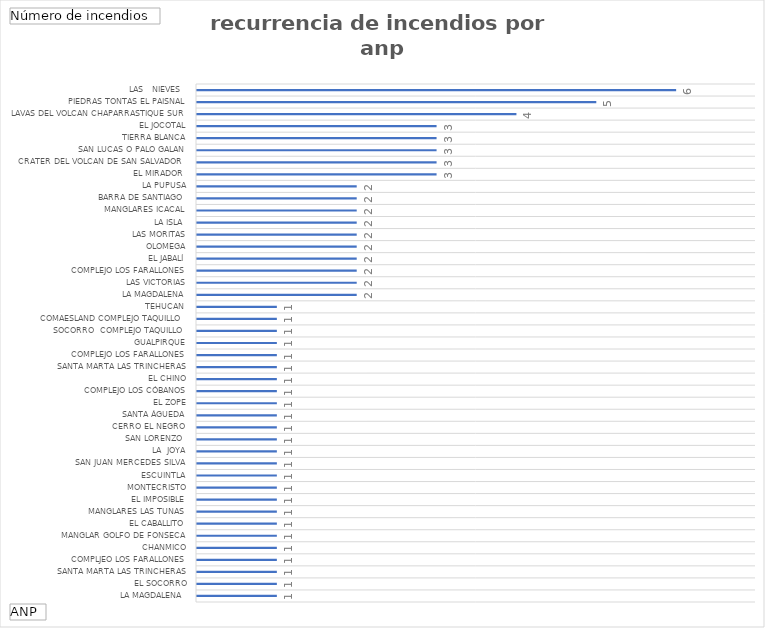
| Category | Total |
|---|---|
| La Magdalena  | 1 |
|  El Socorro | 1 |
|  Santa Marta Las Trincheras, Compljeo Los Farallones | 1 |
| Chanmico | 1 |
| Manglar golfo de Fonseca | 1 |
| El Caballito | 1 |
| Manglares Las Tunas | 1 |
| El Imposible | 1 |
| Montecristo | 1 |
| Escuintla | 1 |
| San Juan Mercedes Silva | 1 |
| La  Joya | 1 |
| San Lorenzo  | 1 |
| Cerro El Negro  | 1 |
| Santa Águeda, El Zope, Complejo Los Cóbanos | 1 |
| El Chino | 1 |
| Santa Marta Las Trincheras, Complejo Los Farallones | 1 |
| Gualpirque | 1 |
| Socorro  Complejo Taquillo  | 1 |
| Comaesland Complejo Taquillo  | 1 |
| Tehucan  | 1 |
| La Magdalena | 1 |
|  Las Victorias, Complejo Los Farallones | 1 |
| El Jabalí | 1 |
|  Olomega | 1 |
| Las Moritas | 2 |
| La Isla  | 2 |
| Manglares Icacal | 2 |
| Barra de Santiago  | 2 |
| La Pupusa | 2 |
| El Mirador  | 2 |
| Crater del Volcan de San Salvador  | 2 |
|  San lucas o Palo galan | 2 |
| Tierra Blanca | 2 |
|  El Jocotal | 2 |
| Lavas del Volcan Chaparrastique sur | 3 |
| Piedras tontas el Paisnal | 3 |
| Las   Nieves   | 3 |
| Chilanguera | 3 |
| San Andres  | 3 |
| Colima | 4 |
| San Marcelino  | 5 |
| Talcualhuya | 6 |